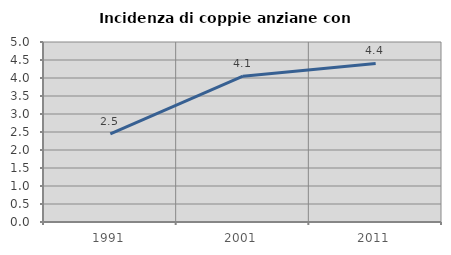
| Category | Incidenza di coppie anziane con figli |
|---|---|
| 1991.0 | 2.451 |
| 2001.0 | 4.051 |
| 2011.0 | 4.405 |